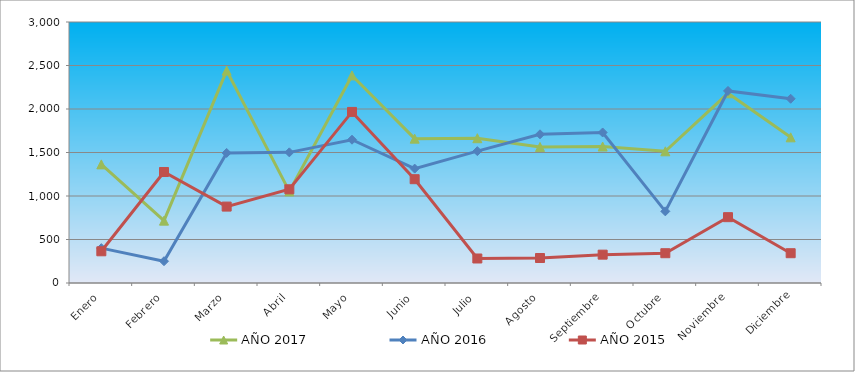
| Category | AÑO 2017 | AÑO 2016 | AÑO 2015 |
|---|---|---|---|
| Enero | 1363.444 | 400.617 | 364.565 |
| Febrero | 716.811 | 250.385 | 1275.977 |
| Marzo | 2441.167 | 1494.832 | 878.27 |
| Abril | 1052.659 | 1501.752 | 1077.123 |
| Mayo | 2386.028 | 1647.083 | 1966.44 |
| Junio | 1659.192 | 1314.898 | 1193.121 |
| Julio | 1664.204 | 1515.593 | 281.709 |
| Agosto | 1563.951 | 1709.368 | 287.233 |
| Septiembre | 1568.964 | 1730.129 | 325.899 |
| Octubre | 1513.824 | 823.541 | 342.47 |
| Noviembre | 2180.508 | 2207.645 | 756.748 |
| Diciembre | 1674.229 | 2117.678 | 342.47 |